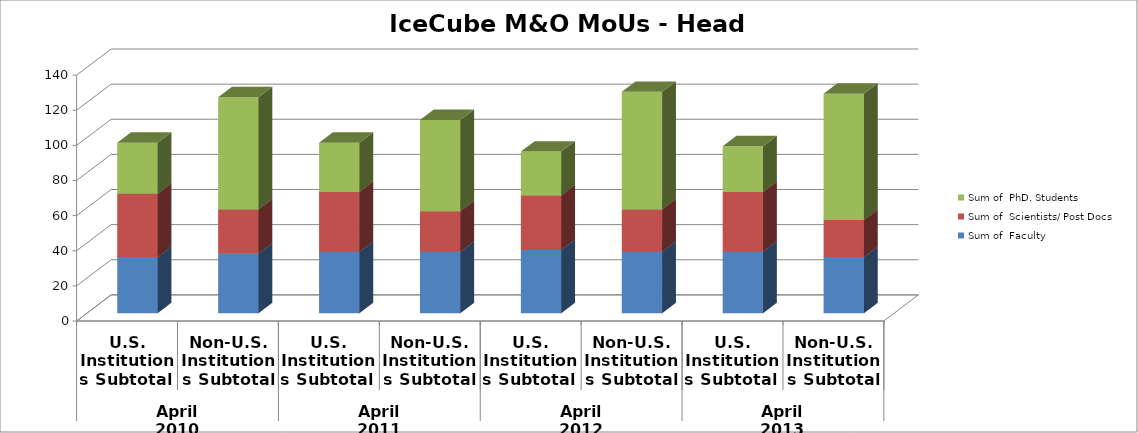
| Category | Sum of  Faculty | Sum of  Scientists/ Post Docs | Sum of  PhD. Students |
|---|---|---|---|
| 0 | 32 | 36 | 29 |
| 1900-01-01 | 34 | 25 | 64 |
| 1900-01-02 | 35 | 34 | 28 |
| 1900-01-03 | 35 | 23 | 52 |
| 1900-01-04 | 36 | 31 | 25 |
| 1900-01-05 | 35 | 24 | 67 |
| 1900-01-06 | 35 | 34 | 26 |
| 1900-01-07 | 32 | 21 | 72 |